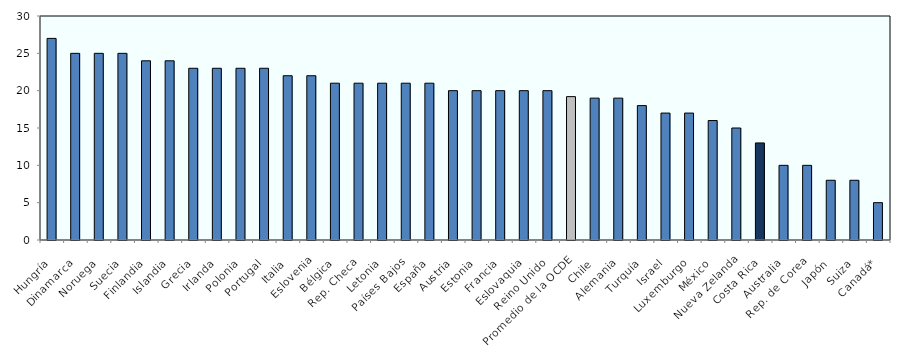
| Category | Tarifas generales del IVA en 2016 |
|---|---|
| Hungría | 27 |
| Dinamarca | 25 |
| Noruega | 25 |
| Suecia | 25 |
| Finlandia | 24 |
| Islandia | 24 |
| Grecia | 23 |
| Irlanda | 23 |
| Polonia | 23 |
| Portugal | 23 |
| Italia | 22 |
| Eslovenia | 22 |
| Bélgica | 21 |
| Rep. Checa | 21 |
| Letonia | 21 |
| Países Bajos | 21 |
| España | 21 |
| Austria | 20 |
| Estonia | 20 |
| Francia | 20 |
| Eslovaquia | 20 |
| Reino Unido | 20 |
| Promedio de la OCDE | 19.2 |
| Chile | 19 |
| Alemania | 19 |
| Turquía | 18 |
| Israel | 17 |
| Luxemburgo | 17 |
| México | 16 |
| Nueva Zelanda | 15 |
| Costa Rica | 13 |
| Australia | 10 |
| Rep. de Corea | 10 |
| Japón | 8 |
| Suiza | 8 |
| Canadá* | 5 |